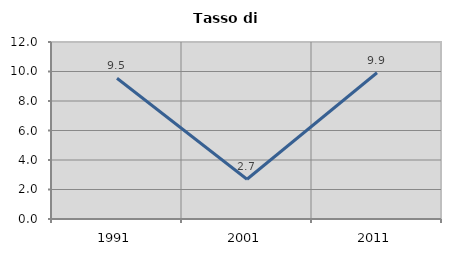
| Category | Tasso di disoccupazione   |
|---|---|
| 1991.0 | 9.544 |
| 2001.0 | 2.693 |
| 2011.0 | 9.917 |